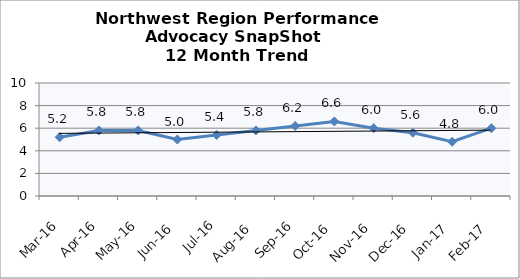
| Category | Northwest Region |
|---|---|
| Mar-16 | 5.2 |
| Apr-16 | 5.8 |
| May-16 | 5.8 |
| Jun-16 | 5 |
| Jul-16 | 5.4 |
| Aug-16 | 5.8 |
| Sep-16 | 6.2 |
| Oct-16 | 6.6 |
| Nov-16 | 6 |
| Dec-16 | 5.6 |
| Jan-17 | 4.8 |
| Feb-17 | 6 |